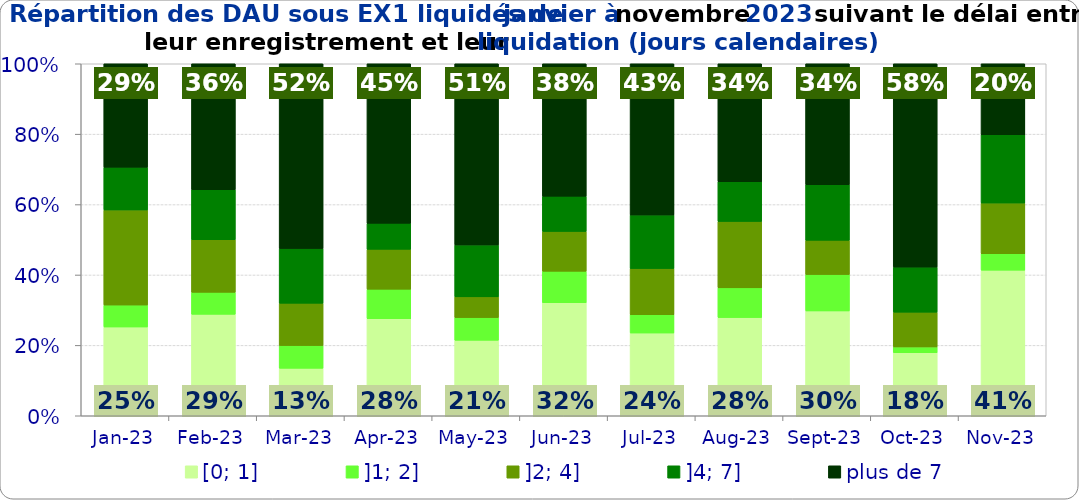
| Category | [0; 1] | ]1; 2] | ]2; 4] | ]4; 7] | plus de 7 |
|---|---|---|---|---|---|
| 2023-01-01 | 0.252 | 0.062 | 0.27 | 0.122 | 0.294 |
| 2023-02-01 | 0.288 | 0.062 | 0.149 | 0.142 | 0.358 |
| 2023-03-01 | 0.135 | 0.065 | 0.12 | 0.155 | 0.525 |
| 2023-04-01 | 0.276 | 0.084 | 0.113 | 0.074 | 0.453 |
| 2023-05-01 | 0.214 | 0.064 | 0.059 | 0.147 | 0.515 |
| 2023-06-01 | 0.321 | 0.089 | 0.113 | 0.1 | 0.376 |
| 2023-07-01 | 0.235 | 0.052 | 0.131 | 0.152 | 0.43 |
| 2023-08-01 | 0.279 | 0.085 | 0.189 | 0.113 | 0.335 |
| 2023-09-01 | 0.298 | 0.103 | 0.097 | 0.158 | 0.343 |
| 2023-10-01 | 0.179 | 0.016 | 0.099 | 0.128 | 0.578 |
| 2023-11-01 | 0.414 | 0.047 | 0.144 | 0.194 | 0.201 |